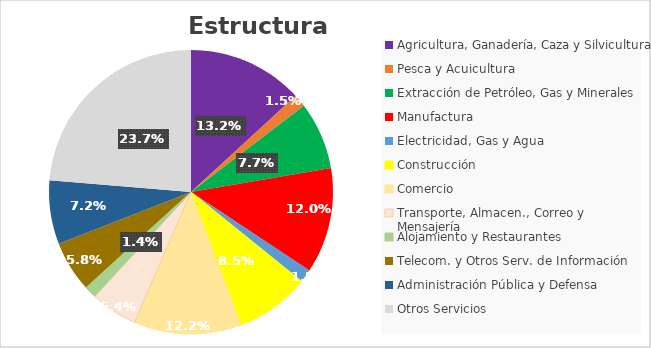
| Category | Series 0 |
|---|---|
| Agricultura, Ganadería, Caza y Silvicultura | 8442263 |
| Pesca y Acuicultura | 932535 |
| Extracción de Petróleo, Gas y Minerales | 4928041 |
| Manufactura | 7710489 |
| Electricidad, Gas y Agua | 945552 |
| Construcción | 5422063 |
| Comercio | 7848971 |
| Transporte, Almacen., Correo y Mensajería | 3444980 |
| Alojamiento y Restaurantes | 875696 |
| Telecom. y Otros Serv. de Información | 3738649 |
| Administración Pública y Defensa | 4645398 |
| Otros Servicios | 15186595 |